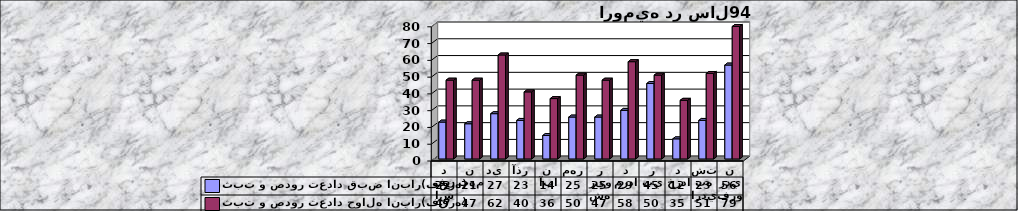
| Category | ثبت و صدور تعداد قبض انبار(فقره) | ثبت و صدور تعداد حواله انبار(فقره) |
|---|---|---|
| اسفند | 22 | 47 |
| بهمن | 21 | 47 |
| دي | 27 | 62 |
| آذر | 23 | 40 |
| آبان  | 14 | 36 |
| مهر | 25 | 50 |
| شهریور | 25 | 47 |
| مرداد | 29 | 58 |
| تير | 45 | 50 |
| خرداد | 12 | 35 |
| ارديبهشت | 23 | 51 |
| فروردين | 56 | 79 |